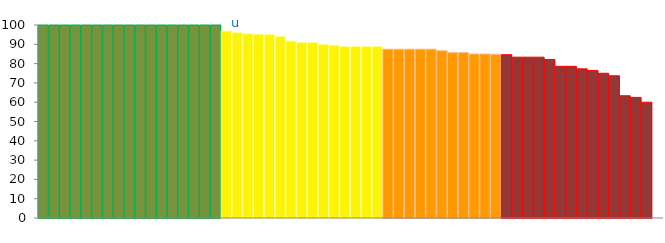
| Category | Top Quartile | 2nd Quartile | 3rd Quartile | Bottom Quartile | Series 4 |
|---|---|---|---|---|---|
|  | 100 | 0 | 0 | 0 | 100 |
|  | 100 | 0 | 0 | 0 | 100 |
|  | 100 | 0 | 0 | 0 | 100 |
|  | 100 | 0 | 0 | 0 | 100 |
|  | 100 | 0 | 0 | 0 | 100 |
|  | 100 | 0 | 0 | 0 | 100 |
|  | 100 | 0 | 0 | 0 | 100 |
|  | 100 | 0 | 0 | 0 | 100 |
|  | 100 | 0 | 0 | 0 | 100 |
|  | 100 | 0 | 0 | 0 | 100 |
|  | 100 | 0 | 0 | 0 | 100 |
|  | 100 | 0 | 0 | 0 | 100 |
|  | 100 | 0 | 0 | 0 | 100 |
|  | 100 | 0 | 0 | 0 | 100 |
|  | 100 | 0 | 0 | 0 | 100 |
|  | 100 | 0 | 0 | 0 | 100 |
|  | 100 | 0 | 0 | 0 | 100 |
|  | 0 | 96.875 | 0 | 0 | 96.875 |
| u | 0 | 96.154 | 0 | 0 | 96.154 |